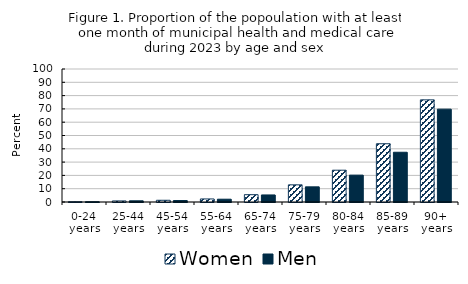
| Category | Women | Men |
|---|---|---|
| 0-24 years | 0.2 | 0.2 |
| 25-44 years | 0.8 | 0.9 |
| 45-54 years | 1.3 | 1.1 |
| 55-64 years | 2.3 | 2.1 |
| 65-74 years | 5.5 | 5.3 |
| 75-79 years | 12.9 | 11.4 |
| 80-84 years | 23.9 | 20.2 |
| 85-89 years | 43.8 | 37.4 |
| 90+ years | 76.8 | 69.8 |